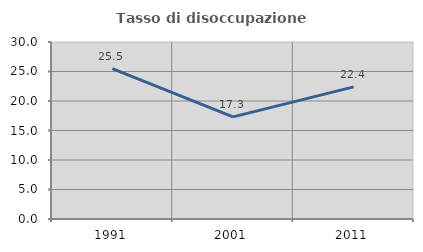
| Category | Tasso di disoccupazione giovanile  |
|---|---|
| 1991.0 | 25.488 |
| 2001.0 | 17.314 |
| 2011.0 | 22.395 |